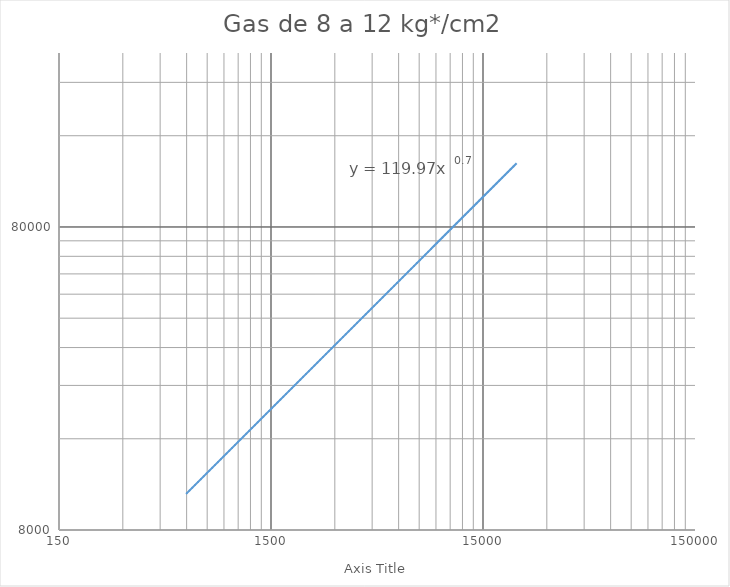
| Category | 1 |
|---|---|
| 600.0 | 10562.36 |
| 850.0 | 13478.711 |
| 1100.0 | 16144.7 |
| 1350.0 | 18633.256 |
| 1600.0 | 20986.456 |
| 1850.0 | 23231.397 |
| 2100.0 | 25386.838 |
| 2350.0 | 27466.455 |
| 2600.0 | 29480.609 |
| 2850.0 | 31437.392 |
| 3100.0 | 33343.278 |
| 3350.0 | 35203.551 |
| 3600.0 | 37022.595 |
| 3850.0 | 38804.1 |
| 4100.0 | 40551.209 |
| 4350.0 | 42266.627 |
| 4600.0 | 43952.703 |
| 4850.0 | 45611.497 |
| 5100.0 | 47244.824 |
| 5350.0 | 48854.296 |
| 5600.0 | 50441.353 |
| 5850.0 | 52007.289 |
| 6100.0 | 53553.27 |
| 6350.0 | 55080.353 |
| 6600.0 | 56589.501 |
| 6850.0 | 58081.592 |
| 7100.0 | 59557.431 |
| 7350.0 | 61017.758 |
| 7600.0 | 62463.257 |
| 7850.0 | 63894.558 |
| 8100.0 | 65312.247 |
| 8350.0 | 66716.867 |
| 8600.0 | 68108.925 |
| 8850.0 | 69488.894 |
| 9100.0 | 70857.216 |
| 9350.0 | 72214.305 |
| 9600.0 | 73560.551 |
| 9850.0 | 74896.319 |
| 10100.0 | 76221.953 |
| 10350.0 | 77537.779 |
| 10600.0 | 78844.103 |
| 10850.0 | 80141.216 |
| 11100.0 | 81429.392 |
| 11350.0 | 82708.894 |
| 11600.0 | 83979.967 |
| 11850.0 | 85242.849 |
| 12100.0 | 86497.762 |
| 12350.0 | 87744.919 |
| 12600.0 | 88984.526 |
| 12850.0 | 90216.775 |
| 13100.0 | 91441.853 |
| 13350.0 | 92659.936 |
| 13600.0 | 93871.195 |
| 13850.0 | 95075.792 |
| 14100.0 | 96273.883 |
| 14350.0 | 97465.618 |
| 14600.0 | 98651.14 |
| 14850.0 | 99830.587 |
| 15100.0 | 101004.093 |
| 15350.0 | 102171.784 |
| 15600.0 | 103333.783 |
| 15850.0 | 104490.209 |
| 16100.0 | 105641.175 |
| 16350.0 | 106786.792 |
| 16600.0 | 107927.165 |
| 16850.0 | 109062.398 |
| 17100.0 | 110192.589 |
| 17350.0 | 111317.833 |
| 17600.0 | 112438.224 |
| 17850.0 | 113553.85 |
| 18100.0 | 114664.798 |
| 18350.0 | 115771.153 |
| 18600.0 | 116872.994 |
| 18850.0 | 117970.402 |
| 19100.0 | 119063.451 |
| 19350.0 | 120152.217 |
| 19600.0 | 121236.771 |
| 19850.0 | 122317.182 |
| 20100.0 | 123393.519 |
| 20350.0 | 124465.847 |
| 20600.0 | 125534.23 |
| 20850.0 | 126598.731 |
| 21100.0 | 127659.409 |
| 21350.0 | 128716.323 |
| 21600.0 | 129769.531 |